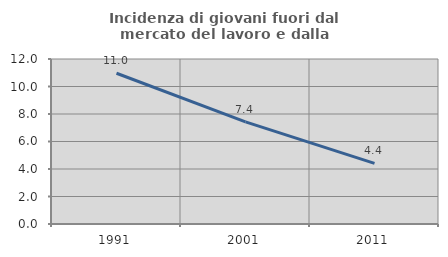
| Category | Incidenza di giovani fuori dal mercato del lavoro e dalla formazione  |
|---|---|
| 1991.0 | 10.963 |
| 2001.0 | 7.425 |
| 2011.0 | 4.407 |